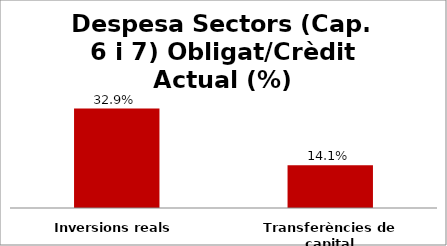
| Category | Series 0 |
|---|---|
| Inversions reals | 0.329 |
| Transferències de capital | 0.141 |